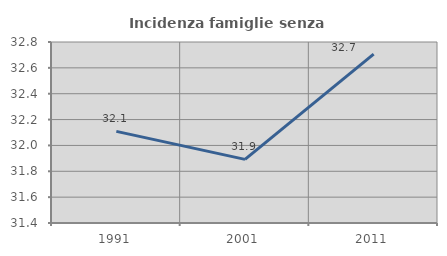
| Category | Incidenza famiglie senza nuclei |
|---|---|
| 1991.0 | 32.109 |
| 2001.0 | 31.892 |
| 2011.0 | 32.706 |